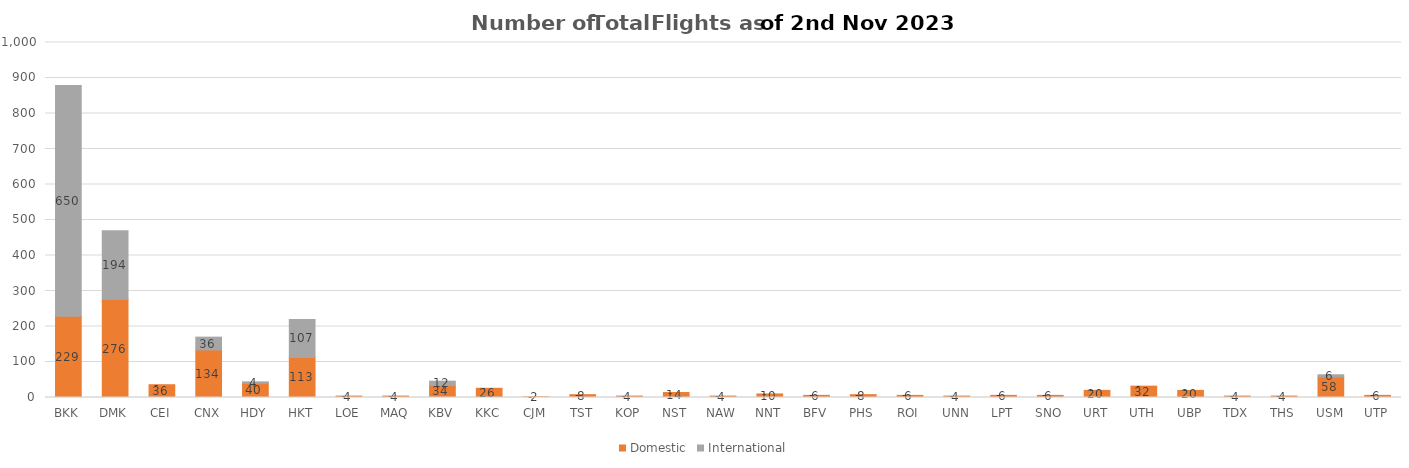
| Category | Domestic | International |
|---|---|---|
| BKK | 229 | 650 |
| DMK | 276 | 194 |
| CEI | 36 | 0 |
| CNX | 134 | 36 |
| HDY | 40 | 4 |
| HKT | 113 | 107 |
| LOE | 4 | 0 |
| MAQ | 4 | 0 |
| KBV | 34 | 12 |
| KKC | 26 | 0 |
| CJM | 2 | 0 |
| TST | 8 | 0 |
| KOP | 4 | 0 |
| NST | 14 | 0 |
| NAW | 4 | 0 |
| NNT | 10 | 0 |
| BFV | 6 | 0 |
| PHS | 8 | 0 |
| ROI | 6 | 0 |
| UNN | 4 | 0 |
| LPT | 6 | 0 |
| SNO | 6 | 0 |
| URT | 20 | 0 |
| UTH | 32 | 0 |
| UBP | 20 | 0 |
| TDX | 4 | 0 |
| THS | 4 | 0 |
| USM | 58 | 6 |
| UTP | 6 | 0 |